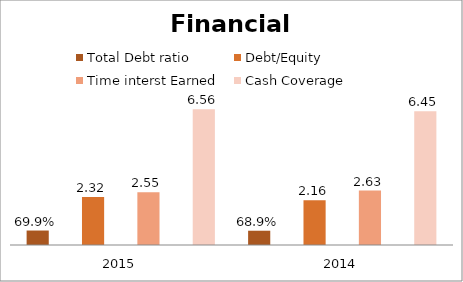
| Category | Total Debt ratio | Series 1 | Debt/Equity | Series 3 | Time interst Earned  | Series 5 | Cash Coverage  |
|---|---|---|---|---|---|---|---|
| 2015.0 | 0.699 |  | 2.318 |  | 2.551 |  | 6.559 |
| 2014.0 | 0.689 |  | 2.159 |  | 2.626 |  | 6.453 |